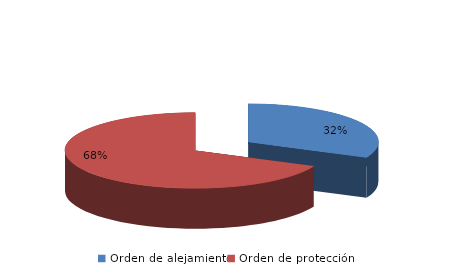
| Category | Series 0 |
|---|---|
| Orden de alejamiento | 56 |
| Orden de protección | 120 |